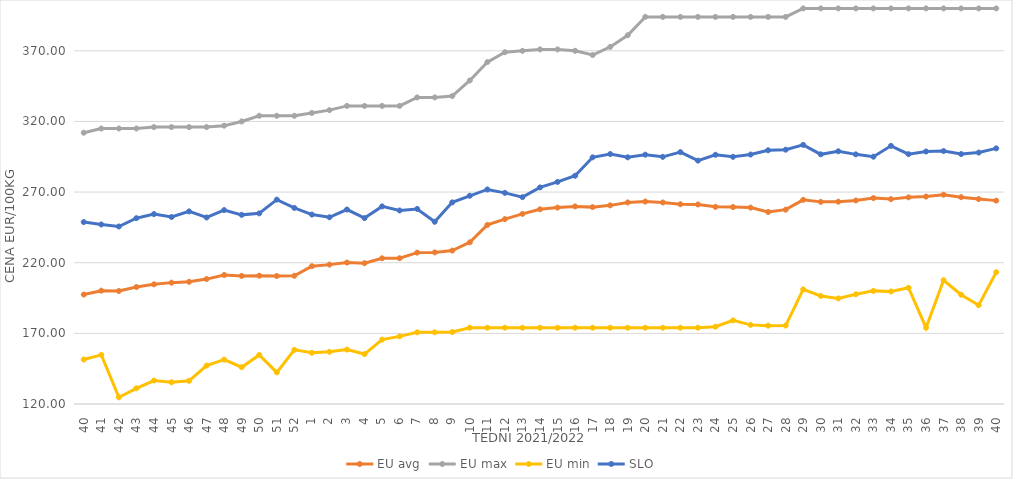
| Category | EU avg | EU max | EU min | SLO |
|---|---|---|---|---|
| 40.0 | 197.482 | 312 | 151.488 | 248.77 |
| 41.0 | 200.22 | 315 | 154.74 | 247.07 |
| 42.0 | 199.965 | 315 | 124.748 | 245.64 |
| 43.0 | 202.804 | 315 | 131.104 | 251.53 |
| 44.0 | 204.713 | 316 | 136.6 | 254.42 |
| 45.0 | 205.906 | 316 | 135.362 | 252.35 |
| 46.0 | 206.476 | 316 | 136.39 | 256.33 |
| 47.0 | 208.415 | 316 | 147.192 | 252.01 |
| 48.0 | 211.314 | 317 | 151.41 | 257.25 |
| 49.0 | 210.677 | 320 | 146.064 | 253.87 |
| 50.0 | 210.823 | 324 | 154.698 | 254.94 |
| 51.0 | 210.59 | 324 | 142.382 | 264.65 |
| 52.0 | 210.763 | 324 | 158.333 | 258.8 |
| 1.0 | 217.519 | 326 | 156.222 | 254.09 |
| 2.0 | 218.654 | 328 | 156.969 | 252.15 |
| 3.0 | 220.098 | 331 | 158.511 | 257.65 |
| 4.0 | 219.685 | 331 | 155.346 | 251.6 |
| 5.0 | 223.143 | 331 | 165.59 | 259.87 |
| 6.0 | 223.178 | 331 | 167.86 | 256.97 |
| 7.0 | 227.145 | 337 | 170.719 | 258.07 |
| 8.0 | 227.312 | 337 | 170.743 | 248.97 |
| 9.0 | 228.588 | 338 | 170.92 | 262.72 |
| 10.0 | 234.434 | 349 | 174 | 267.38 |
| 11.0 | 246.762 | 362 | 174 | 271.86 |
| 12.0 | 250.845 | 369 | 174 | 269.43 |
| 13.0 | 254.568 | 370 | 174 | 266.39 |
| 14.0 | 257.819 | 371 | 174 | 273.3 |
| 15.0 | 259 | 371 | 174 | 277.18 |
| 16.0 | 259.873 | 370 | 174 | 281.55 |
| 17.0 | 259.351 | 367 | 174 | 294.59 |
| 18.0 | 260.6 | 372.758 | 174 | 296.93 |
| 19.0 | 262.669 | 381 | 174 | 294.6 |
| 20.0 | 263.291 | 394 | 174 | 296.48 |
| 21.0 | 262.64 | 394 | 174 | 294.94 |
| 22.0 | 261.388 | 394 | 174 | 298.26 |
| 23.0 | 261.228 | 394 | 174 | 292.27 |
| 24.0 | 259.544 | 394 | 174.72 | 296.39 |
| 25.0 | 259.395 | 394 | 179.2 | 294.93 |
| 26.0 | 259.018 | 394 | 176 | 296.56 |
| 27.0 | 255.922 | 394 | 175.451 | 299.59 |
| 28.0 | 257.564 | 394 | 175.52 | 300.01 |
| 29.0 | 264.52 | 400 | 201.097 | 303.41 |
| 30.0 | 263.067 | 400 | 196.496 | 296.73 |
| 31.0 | 263.196 | 400 | 194.756 | 298.88 |
| 32.0 | 264.059 | 400 | 197.634 | 296.7 |
| 33.0 | 265.729 | 400 | 200.07 | 295.05 |
| 34.0 | 265.016 | 400 | 199.637 | 302.73 |
| 35.0 | 266.273 | 400 | 202.277 | 296.86 |
| 36.0 | 266.807 | 400 | 174 | 298.7 |
| 37.0 | 268.136 | 400 | 207.594 | 299.02 |
| 38.0 | 266.39 | 400 | 197.352 | 296.91 |
| 39.0 | 265.059 | 400 | 189.926 | 297.96 |
| 40.0 | 263.949 | 400 | 213.29 | 300.95 |